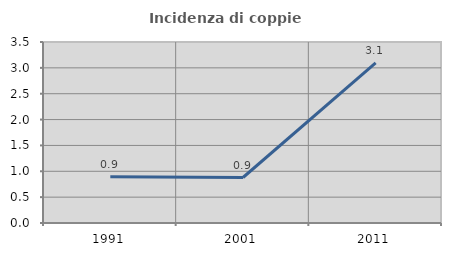
| Category | Incidenza di coppie miste |
|---|---|
| 1991.0 | 0.893 |
| 2001.0 | 0.88 |
| 2011.0 | 3.096 |